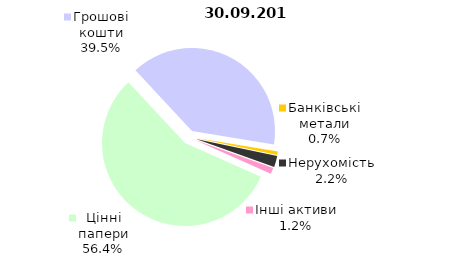
| Category | Всього |
|---|---|
| Цінні папери | 749.702 |
| Грошові кошти | 525.247 |
| Банківські метали | 9.387 |
| Нерухомість | 28.673 |
| Інші активи | 16.122 |